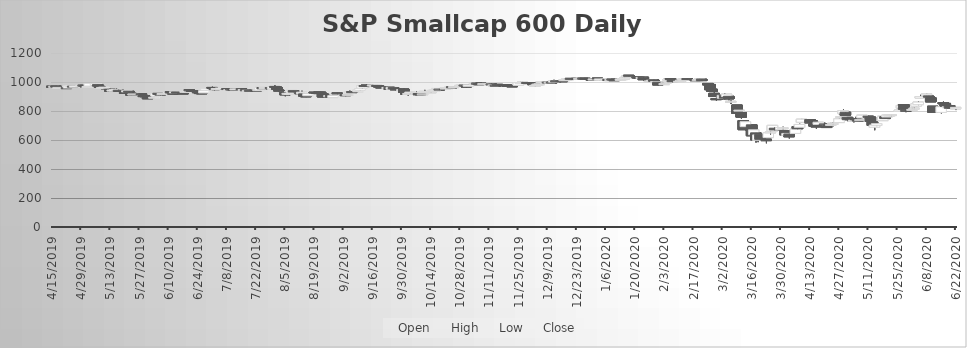
| Category | Open | High | Low | Close |
|---|---|---|---|---|
| 4/15/19 | 971.08 | 972.6 | 963.48 | 966.08 |
| 4/16/19 | 968.86 | 970.99 | 966.23 | 970.12 |
| 4/17/19 | 972.59 | 973.61 | 960.33 | 964.55 |
| 4/18/19 | 962.41 | 965.81 | 958.15 | 962.66 |
| 4/22/19 | 961.51 | 961.51 | 953.13 | 957.25 |
| 4/23/19 | 958.48 | 973.85 | 957.98 | 971.62 |
| 4/24/19 | 971.22 | 977.14 | 970.28 | 973.85 |
| 4/25/19 | 971.2 | 971.2 | 958.02 | 964.06 |
| 4/26/19 | 964.31 | 973.02 | 962.13 | 972.87 |
| 4/29/19 | 973.54 | 980.72 | 973.35 | 976.96 |
| 4/30/19 | 977.88 | 978.35 | 968.33 | 975.06 |
| 5/1/19 | 976.62 | 977.81 | 966.39 | 966.76 |
| 5/2/19 | 964.6 | 973.69 | 960.07 | 969.1 |
| 5/3/19 | 972.05 | 989.41 | 972.05 | 989.22 |
| 5/6/19 | 976.1 | 991.44 | 973.47 | 989.32 |
| 5/7/19 | 982.06 | 983.67 | 963.93 | 971.02 |
| 5/8/19 | 969.7 | 973.15 | 963.47 | 963.63 |
| 5/9/19 | 957.44 | 964.14 | 948.51 | 962.41 |
| 5/10/19 | 958.89 | 965.58 | 947.04 | 964.29 |
| 5/13/19 | 950.34 | 950.34 | 932.52 | 934.68 |
| 5/14/19 | 937.25 | 948.08 | 936.33 | 944.77 |
| 5/15/19 | 937.94 | 947.78 | 936.19 | 946.06 |
| 5/16/19 | 947.03 | 955.95 | 947.03 | 949.34 |
| 5/17/19 | 942.95 | 948.69 | 933.58 | 934.56 |
| 5/20/19 | 928.6 | 933.63 | 925.79 | 928.23 |
| 5/21/19 | 932.3 | 941.04 | 932.3 | 939.63 |
| 5/22/19 | 936.18 | 936.59 | 927.77 | 930.24 |
| 5/23/19 | 922.38 | 922.38 | 904.74 | 909.45 |
| 5/24/19 | 914.52 | 918.85 | 911.77 | 917.54 |
| 5/28/19 | 918.65 | 921.36 | 911.71 | 911.79 |
| 5/29/19 | 906.33 | 906.33 | 897.58 | 904.09 |
| 5/30/19 | 905.58 | 911.04 | 896.77 | 901.32 |
| 5/31/19 | 891.46 | 892.78 | 885.7 | 888.72 |
| 6/3/19 | 888.96 | 897.83 | 887.5 | 894.52 |
| 6/4/19 | 902.82 | 919.01 | 902.82 | 918.89 |
| 6/5/19 | 921.13 | 922.06 | 908.14 | 916.22 |
| 6/6/19 | 915.93 | 918.16 | 904.32 | 913.42 |
| 6/7/19 | 915.9 | 923.44 | 914.97 | 919.89 |
| 6/10/19 | 924 | 933.38 | 923.87 | 926.6 |
| 6/11/19 | 932.19 | 935.04 | 920.44 | 924.04 |
| 6/12/19 | 922.14 | 924.01 | 918.44 | 921.83 |
| 6/13/19 | 925.52 | 932.63 | 925.39 | 932.22 |
| 6/14/19 | 930.81 | 930.81 | 923.54 | 923.57 |
| 6/17/19 | 924.55 | 929.19 | 923.48 | 924.01 |
| 6/18/19 | 928.81 | 942.63 | 928.81 | 936.03 |
| 6/19/19 | 936.38 | 938.8 | 933.84 | 938.16 |
| 6/20/19 | 946.13 | 948 | 939.96 | 945.14 |
| 6/21/19 | 941.29 | 942.7 | 934.54 | 937.05 |
| 6/24/19 | 938.24 | 938.97 | 926.54 | 926.59 |
| 6/25/19 | 927.19 | 928.58 | 921.79 | 922.19 |
| 6/26/19 | 925.53 | 928.37 | 922.42 | 922.64 |
| 6/27/19 | 924.67 | 940.34 | 924.67 | 940.34 |
| 6/28/19 | 942.59 | 955.1 | 942.59 | 953.25 |
| 7/1/19 | 962.35 | 967.46 | 950.27 | 954.83 |
| 7/2/19 | 954.39 | 954.39 | 943.25 | 948.46 |
| 7/3/19 | 950.9 | 955.14 | 949.89 | 954.92 |
| 7/5/19 | 951.55 | 958.48 | 946.45 | 958.42 |
| 7/8/19 | 955.05 | 955.94 | 947.16 | 948.66 |
| 7/9/19 | 945.2 | 947.1 | 942.31 | 946.94 |
| 7/10/19 | 951.2 | 953.76 | 945.8 | 948.75 |
| 7/11/19 | 949.94 | 950.71 | 939.98 | 944.35 |
| 7/12/19 | 945.72 | 955.78 | 944.47 | 952.53 |
| 7/15/19 | 954.19 | 955.42 | 944.17 | 946.96 |
| 7/16/19 | 946.05 | 953.06 | 944.12 | 948.23 |
| 7/17/19 | 947.61 | 947.61 | 939.05 | 940.88 |
| 7/18/19 | 940.22 | 944.34 | 937.59 | 942.66 |
| 7/19/19 | 942.26 | 948.68 | 940.2 | 940.44 |
| 7/22/19 | 942.12 | 945.51 | 937.26 | 938.25 |
| 7/23/19 | 941.79 | 947 | 939.37 | 946.92 |
| 7/24/19 | 943.96 | 963.9 | 943.68 | 962.84 |
| 7/25/19 | 962.06 | 963.18 | 951.86 | 953.1 |
| 7/26/19 | 955.85 | 964.35 | 955.41 | 962.51 |
| 7/29/19 | 962.02 | 962.94 | 955.15 | 957.27 |
| 7/30/19 | 952.42 | 968.18 | 950.46 | 967.7 |
| 7/31/19 | 969.14 | 977.96 | 958.4 | 963.4 |
| 8/1/19 | 964.67 | 971.28 | 945.12 | 948.24 |
| 8/2/19 | 944.65 | 944.65 | 930.79 | 938.14 |
| 8/5/19 | 927.47 | 927.47 | 901.75 | 911.71 |
| 8/6/19 | 916.84 | 922.6 | 909.91 | 921.79 |
| 8/7/19 | 914.16 | 925.16 | 908.72 | 922.68 |
| 8/8/19 | 927.2 | 943.04 | 927.2 | 942.35 |
| 8/9/19 | 940.4 | 940.4 | 928.81 | 930.75 |
| 8/12/19 | 926.26 | 926.26 | 918.79 | 920.62 |
| 8/13/19 | 918.9 | 939.57 | 917.9 | 929.89 |
| 8/14/19 | 918.02 | 918.02 | 900.8 | 902.75 |
| 8/15/19 | 904.86 | 905.06 | 895.9 | 899.48 |
| 8/16/19 | 905.15 | 920.83 | 905.15 | 919.62 |
| 8/19/19 | 929.46 | 934.39 | 928.55 | 929.36 |
| 8/20/19 | 927.1 | 927.1 | 920.69 | 920.86 |
| 8/21/19 | 928.82 | 929.19 | 925.62 | 928.11 |
| 8/22/19 | 930.32 | 932.48 | 922.06 | 925.35 |
| 8/23/19 | 920.5 | 925.03 | 894.72 | 896.5 |
| 8/26/19 | 904.38 | 906.37 | 900.24 | 905.91 |
| 8/27/19 | 912.1 | 912.1 | 894.2 | 895.22 |
| 8/28/19 | 892.82 | 910.39 | 891.6 | 906.02 |
| 8/29/19 | 914.12 | 921.75 | 914.12 | 920.04 |
| 8/30/19 | 924.41 | 925.43 | 914.85 | 918.74 |
| 9/3/19 | 913.07 | 914.96 | 902.43 | 905.97 |
| 9/4/19 | 913.27 | 916.73 | 910.7 | 914.47 |
| 9/5/19 | 924.22 | 940.36 | 923.65 | 932.4 |
| 9/6/19 | 933.77 | 936.66 | 929.7 | 930.11 |
| 9/9/19 | 932.71 | 943.6 | 930.9 | 943.39 |
| 9/10/19 | 942.52 | 955.27 | 938.14 | 954.91 |
| 9/11/19 | 957.51 | 975.46 | 952.59 | 974.99 |
| 9/12/19 | 975.39 | 978.59 | 965.21 | 974.43 |
| 9/13/19 | 978.65 | 983.13 | 975.13 | 975.95 |
| 9/16/19 | 973.43 | 982.98 | 972.84 | 979.19 |
| 9/17/19 | 976.05 | 977.03 | 970.09 | 976.6 |
| 9/18/19 | 976.06 | 976.06 | 962.95 | 970.34 |
| 9/19/19 | 972.53 | 977.88 | 964.79 | 965.34 |
| 9/20/19 | 965.97 | 969.54 | 958.17 | 962.11 |
| 9/23/19 | 958.31 | 966.5 | 957.18 | 962.44 |
| 9/24/19 | 964.33 | 965.7 | 948.45 | 950.06 |
| 9/25/19 | 950.11 | 964.43 | 949.51 | 962.76 |
| 9/26/19 | 961.36 | 961.59 | 949.98 | 952.48 |
| 9/27/19 | 954.31 | 957.75 | 942.26 | 946.31 |
| 9/30/19 | 947.62 | 952.54 | 944.97 | 947.72 |
| 10/1/19 | 951.93 | 958.34 | 926.66 | 929.27 |
| 10/2/19 | 922.81 | 923.5 | 912.94 | 919.11 |
| 10/3/19 | 916.19 | 922.16 | 906.71 | 921.11 |
| 10/4/19 | 922.78 | 930.53 | 918.66 | 930.46 |
| 10/7/19 | 927.92 | 935.15 | 924.01 | 928.71 |
| 10/8/19 | 920.44 | 920.49 | 912.25 | 912.64 |
| 10/9/19 | 919 | 919.66 | 914.13 | 916.17 |
| 10/10/19 | 918.12 | 923.33 | 916.45 | 918.36 |
| 10/11/19 | 929.21 | 945.59 | 929.21 | 935.6 |
| 10/14/19 | 932.14 | 933.11 | 926.79 | 932.17 |
| 10/15/19 | 934.38 | 946.41 | 932.27 | 942.32 |
| 10/16/19 | 940.74 | 949.08 | 940.74 | 945.05 |
| 10/17/19 | 949.28 | 956.11 | 948.42 | 955.41 |
| 10/18/19 | 950.84 | 955.22 | 943.87 | 950.37 |
| 10/21/19 | 957.08 | 964.24 | 957.08 | 958.85 |
| 10/22/19 | 960.68 | 965.38 | 955.53 | 961.41 |
| 10/23/19 | 960.43 | 963.96 | 957.29 | 963.82 |
| 10/24/19 | 966.51 | 966.51 | 957.31 | 961.55 |
| 10/25/19 | 961.29 | 970.6 | 960.58 | 968.12 |
| 10/28/19 | 971.59 | 980.44 | 971.54 | 976.54 |
| 10/29/19 | 974.38 | 983.06 | 973.92 | 980.36 |
| 10/30/19 | 978.78 | 979.24 | 968.61 | 975.91 |
| 10/31/19 | 972.19 | 972.19 | 958.91 | 965.35 |
| 11/1/19 | 970.4 | 980.79 | 970.01 | 980.42 |
| 11/4/19 | 987.38 | 990.29 | 984.67 | 988.81 |
| 11/5/19 | 991.16 | 997.05 | 989.21 | 990.18 |
| 11/6/19 | 988.19 | 989.19 | 982.42 | 984.54 |
| 11/7/19 | 992.11 | 996.68 | 984.97 | 987.52 |
| 11/8/19 | 985.27 | 989.27 | 982.49 | 988.56 |
| 11/11/19 | 983.42 | 986.38 | 981.57 | 985.62 |
| 11/12/19 | 986.88 | 991.52 | 984.02 | 985.47 |
| 11/13/19 | 979.18 | 981.69 | 975.2 | 979.62 |
| 11/14/19 | 978.3 | 982.9 | 976.7 | 977.88 |
| 11/15/19 | 983.75 | 984.12 | 977.82 | 982.71 |
| 11/18/19 | 980.81 | 980.81 | 976.34 | 978.66 |
| 11/19/19 | 982.44 | 983.42 | 977.47 | 980.21 |
| 11/20/19 | 975.8 | 982.3 | 969.3 | 974.03 |
| 11/21/19 | 976.54 | 976.55 | 967.08 | 969.46 |
| 11/22/19 | 973.64 | 973.74 | 967.64 | 972.13 |
| 11/25/19 | 976.8 | 998.1 | 976.61 | 995.86 |
| 11/26/19 | 995.41 | 1000.84 | 993.55 | 995.57 |
| 11/27/19 | 997.82 | 1001.13 | 996.65 | 999.99 |
| 11/29/19 | 996.14 | 998.36 | 992.88 | 993.51 |
| 12/2/19 | 994.94 | 994.95 | 980.69 | 981.57 |
| 12/3/19 | 972.98 | 977.93 | 968.87 | 977.51 |
| 12/4/19 | 981.38 | 989.24 | 981.38 | 985.29 |
| 12/5/19 | 987.87 | 991.09 | 985.38 | 988.01 |
| 12/6/19 | 996.02 | 1006.07 | 995.96 | 1002.13 |
| 12/9/19 | 999.71 | 1002.71 | 998.96 | 999.06 |
| 12/10/19 | 998.14 | 1001.44 | 996.15 | 998.87 |
| 12/11/19 | 999.52 | 1000.31 | 995.07 | 999.04 |
| 12/12/19 | 999.27 | 1015.3 | 997.7 | 1009.59 |
| 12/13/19 | 1008.34 | 1012.19 | 999.96 | 1002.79 |
| 12/16/19 | 1008.63 | 1015.7 | 1007.58 | 1007.93 |
| 12/17/19 | 1010.05 | 1015.8 | 1009.18 | 1015.72 |
| 12/18/19 | 1017.46 | 1020.89 | 1013.85 | 1019.53 |
| 12/19/19 | 1019.81 | 1022.5 | 1018.08 | 1022.44 |
| 12/20/19 | 1024.89 | 1026.15 | 1021.66 | 1022.88 |
| 12/23/19 | 1024.68 | 1024.99 | 1018.63 | 1022.67 |
| 12/24/19 | 1024 | 1024.7 | 1022.39 | 1024.69 |
| 12/26/19 | 1025.76 | 1026.04 | 1021.65 | 1023.7 |
| 12/27/19 | 1025.73 | 1025.89 | 1017.34 | 1018.87 |
| 12/30/19 | 1019.86 | 1022.39 | 1014.03 | 1018.02 |
| 12/31/19 | 1015.06 | 1024.55 | 1014.73 | 1021.18 |
| 1/2/20 | 1026.94 | 1027.08 | 1012.4 | 1020.83 |
| 1/3/20 | 1012.26 | 1021.73 | 1011.31 | 1020.93 |
| 1/6/20 | 1014.3 | 1021.02 | 1009.85 | 1019.76 |
| 1/7/20 | 1017.1 | 1017.7 | 1012.56 | 1014.09 |
| 1/8/20 | 1013.71 | 1019.95 | 1013.66 | 1016.51 |
| 1/9/20 | 1020.12 | 1020.65 | 1014.9 | 1015.79 |
| 1/10/20 | 1016.13 | 1016.15 | 1006.82 | 1010.84 |
| 1/13/20 | 1011.02 | 1020.46 | 1008.29 | 1020.33 |
| 1/14/20 | 1019.59 | 1029.19 | 1016.52 | 1023.68 |
| 1/15/20 | 1021.73 | 1031.15 | 1021.34 | 1027.61 |
| 1/16/20 | 1034.44 | 1043.68 | 1034.11 | 1041.03 |
| 1/17/20 | 1046.34 | 1046.34 | 1037.6 | 1039.28 |
| 1/21/20 | 1035.43 | 1035.43 | 1027.99 | 1029.72 |
| 1/22/20 | 1033.11 | 1034.84 | 1028.34 | 1029.52 |
| 1/23/20 | 1027.57 | 1032.3 | 1018.87 | 1031.47 |
| 1/24/20 | 1033.48 | 1033.48 | 1010.16 | 1015.98 |
| 1/27/20 | 1003.18 | 1009.3 | 996.77 | 1003.93 |
| 1/28/20 | 1009.43 | 1014.67 | 1008.05 | 1012.23 |
| 1/29/20 | 1014.14 | 1016.33 | 1004.28 | 1004.42 |
| 1/30/20 | 998.66 | 1003.47 | 992.64 | 1003.03 |
| 1/31/20 | 998.35 | 998.78 | 977.68 | 979.84 |
| 2/3/20 | 983.45 | 993.59 | 983.45 | 988.83 |
| 2/4/20 | 999.32 | 1005.05 | 999.32 | 1001.12 |
| 2/5/20 | 1009.61 | 1021.19 | 1008.62 | 1020.2 |
| 2/6/20 | 1024.13 | 1024.84 | 1016.37 | 1016.66 |
| 2/7/20 | 1013.29 | 1013.29 | 999.9 | 1002.05 |
| 2/10/20 | 1000.29 | 1005.64 | 999.44 | 1005.6 |
| 2/11/20 | 1010.79 | 1019.18 | 1009.81 | 1012.97 |
| 2/12/20 | 1018.41 | 1020.4 | 1015.82 | 1019.72 |
| 2/13/20 | 1015.6 | 1024.89 | 1014.13 | 1023.47 |
| 2/14/20 | 1023.64 | 1023.64 | 1015.37 | 1018.27 |
| 2/18/20 | 1016.12 | 1017.59 | 1007.72 | 1012.67 |
| 2/19/20 | 1015.22 | 1019.33 | 1013.51 | 1016.31 |
| 2/20/20 | 1014.36 | 1023.21 | 1010.71 | 1020.96 |
| 2/21/20 | 1019.37 | 1019.37 | 1006.26 | 1009.62 |
| 2/24/20 | 990.08 | 990.08 | 975.2 | 980.05 |
| 2/25/20 | 982.99 | 983.43 | 944.49 | 946.92 |
| 2/26/20 | 950.42 | 957.06 | 934.38 | 935.03 |
| 2/27/20 | 921.7 | 933.63 | 898.19 | 899.84 |
| 2/28/20 | 885.24 | 893.25 | 869.24 | 884.78 |
| 3/2/20 | 888.03 | 907.98 | 876.06 | 907.89 |
| 3/3/20 | 908.19 | 922.78 | 879.73 | 888.6 |
| 3/4/20 | 899.36 | 916.47 | 892.39 | 916.47 |
| 3/5/20 | 901.56 | 901.56 | 873.87 | 883.67 |
| 3/6/20 | 866.82 | 875.8 | 848.02 | 867.2 |
| 3/9/20 | 841.25 | 841.25 | 782.37 | 783.53 |
| 3/10/20 | 800.36 | 807.85 | 770.17 | 806.03 |
| 3/11/20 | 788.92 | 789.16 | 747.56 | 757.53 |
| 3/12/20 | 733.95 | 733.95 | 671.07 | 671.3 |
| 3/13/20 | 692.1 | 725.98 | 666.18 | 725.98 |
| 3/16/20 | 704.65 | 704.65 | 628.11 | 629.36 |
| 3/17/20 | 636.77 | 670.06 | 612.61 | 670.06 |
| 3/18/20 | 649.4 | 649.4 | 582.41 | 600.82 |
| 3/19/20 | 598.9 | 643.9 | 585.07 | 635.19 |
| 3/20/20 | 639.04 | 652.15 | 601.66 | 604.59 |
| 3/23/20 | 606.14 | 607.18 | 577.38 | 595.67 |
| 3/24/20 | 616.81 | 649.34 | 616.81 | 649.32 |
| 3/25/20 | 651.08 | 681.96 | 634.81 | 655.4 |
| 3/26/20 | 662.19 | 701.58 | 662.19 | 700.66 |
| 3/27/20 | 681.41 | 689.03 | 665.03 | 669.88 |
| 3/30/20 | 672.34 | 686.34 | 660.64 | 685.32 |
| 3/31/20 | 682.74 | 691.24 | 671.95 | 684.84 |
| 4/1/20 | 663.17 | 663.17 | 630.15 | 635.66 |
| 4/2/20 | 631.56 | 657.06 | 627.26 | 645.29 |
| 4/3/20 | 640.98 | 645.26 | 610.39 | 622.35 |
| 4/6/20 | 645.21 | 675.91 | 645.21 | 674.65 |
| 4/7/20 | 692.62 | 709.88 | 673.13 | 677.65 |
| 4/8/20 | 687.81 | 711.91 | 680.86 | 707.08 |
| 4/9/20 | 722.61 | 745.16 | 722.61 | 743.23 |
| 4/13/20 | 740.66 | 740.66 | 711.24 | 718.35 |
| 4/14/20 | 732.89 | 741.39 | 722.34 | 731.1 |
| 4/15/20 | 711.83 | 711.83 | 691.75 | 695.73 |
| 4/16/20 | 697.35 | 704.15 | 677.65 | 691.42 |
| 4/17/20 | 707.72 | 724.54 | 707.72 | 722.58 |
| 4/20/20 | 710.97 | 719.95 | 701.83 | 708.12 |
| 4/21/20 | 692.85 | 698.33 | 685.63 | 692.66 |
| 4/22/20 | 705.6 | 709.64 | 695.76 | 698.74 |
| 4/23/20 | 700.86 | 717.88 | 700.86 | 707.49 |
| 4/24/20 | 711.78 | 719.55 | 704.3 | 715.14 |
| 4/27/20 | 720.35 | 751.16 | 720.35 | 745.84 |
| 4/28/20 | 760.94 | 769.02 | 750.63 | 761.08 |
| 4/29/20 | 780.7 | 810.26 | 778.49 | 802.96 |
| 4/30/20 | 791.71 | 791.71 | 770.15 | 771.11 |
| 5/1/20 | 756.28 | 756.28 | 730.06 | 740.02 |
| 5/4/20 | 730.49 | 739.11 | 721.72 | 736.02 |
| 5/5/20 | 747.18 | 759.81 | 736.73 | 738.71 |
| 5/6/20 | 742.07 | 747.26 | 728.43 | 729.41 |
| 5/7/20 | 738.86 | 745.8 | 735.98 | 740.46 |
| 5/8/20 | 752.44 | 770.87 | 752.44 | 770.87 |
| 5/11/20 | 764.21 | 766.27 | 747.96 | 756.76 |
| 5/12/20 | 758.74 | 761.23 | 728.5 | 728.74 |
| 5/13/20 | 724.77 | 724.77 | 691.01 | 700.59 |
| 5/14/20 | 688.19 | 703.17 | 667.48 | 703.17 |
| 5/15/20 | 700.85 | 715.7 | 695.16 | 712.38 |
| 5/18/20 | 733.69 | 766.71 | 733.69 | 763.72 |
| 5/19/20 | 760.75 | 766.86 | 747.55 | 747.78 |
| 5/20/20 | 758.44 | 774.89 | 758.44 | 771.25 |
| 5/21/20 | 769.96 | 776.55 | 763.84 | 771.41 |
| 5/22/20 | 774.44 | 775.58 | 763.86 | 775.34 |
| 5/26/20 | 796.53 | 811.37 | 796.53 | 806.47 |
| 5/27/20 | 820.44 | 839.74 | 806.23 | 837.98 |
| 5/28/20 | 844.72 | 846.92 | 808.79 | 811.49 |
| 5/29/20 | 804.05 | 807.13 | 791.94 | 803.11 |
| 6/1/20 | 805.24 | 821.52 | 803.54 | 811 |
| 6/2/20 | 817.24 | 823.81 | 812.74 | 820.26 |
| 6/3/20 | 833.24 | 854.4 | 833.24 | 849.27 |
| 6/4/20 | 843.89 | 866.95 | 839.86 | 861.45 |
| 6/5/20 | 889.04 | 911.53 | 889.04 | 899.33 |
| 6/8/20 | 910.8 | 919.91 | 908.41 | 917.81 |
| 6/9/20 | 902.99 | 904.82 | 886.84 | 894.77 |
| 6/10/20 | 891.48 | 891.48 | 862.87 | 863.09 |
| 6/11/20 | 832.8 | 832.8 | 791.34 | 792.25 |
| 6/12/20 | 819.93 | 830.06 | 790.85 | 812.49 |
| 6/15/20 | 790.4 | 835.67 | 783.83 | 829.29 |
| 6/16/20 | 857.5 | 864.97 | 835.08 | 850.16 |
| 6/17/20 | 852.39 | 852.39 | 831.31 | 832.2 |
| 6/18/20 | 824.25 | 838.7 | 821.71 | 829.29 |
| 6/19/20 | 836.89 | 839.57 | 814.22 | 818.76 |
| 6/22/20 | 814.78 | 825.18 | 806.5 | 825.08 |